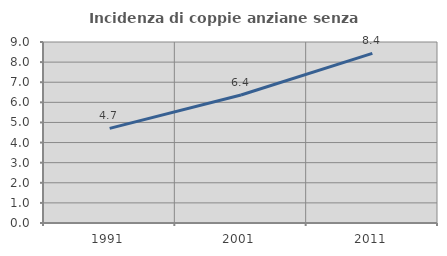
| Category | Incidenza di coppie anziane senza figli  |
|---|---|
| 1991.0 | 4.706 |
| 2001.0 | 6.363 |
| 2011.0 | 8.434 |